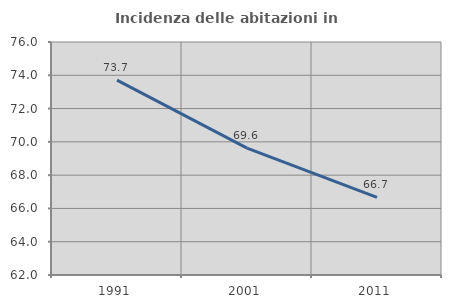
| Category | Incidenza delle abitazioni in proprietà  |
|---|---|
| 1991.0 | 73.711 |
| 2001.0 | 69.626 |
| 2011.0 | 66.667 |